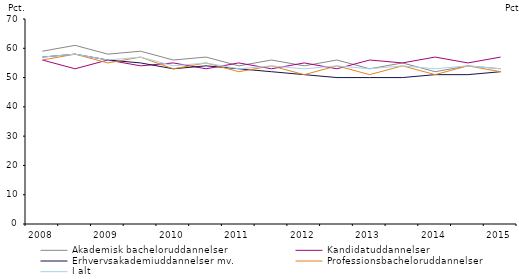
| Category | Akademisk bacheloruddannelser | Kandidatuddannelser | Erhvervsakademiuddannelser mv. | Professionsbacheloruddannelser | I alt |
|---|---|---|---|---|---|
| 2008.0 | 59 | 56 | 57 | 56 | 57 |
| nan | 61 | 53 | 58 | 58 | 58 |
| 2009.0 | 58 | 56 | 56 | 55 | 56 |
| nan | 59 | 54 | 55 | 57 | 57 |
| 2010.0 | 56 | 55 | 53 | 53 | 54 |
| nan | 57 | 53 | 54 | 55 | 55 |
| 2011.0 | 54 | 55 | 53 | 52 | 53 |
| nan | 56 | 53 | 52 | 54 | 54 |
| 2012.0 | 54 | 55 | 51 | 51 | 53 |
| nan | 56 | 53 | 50 | 54 | 54 |
| 2013.0 | 53 | 56 | 50 | 51 | 53 |
| nan | 55 | 55 | 50 | 54 | 54 |
| 2014.0 | 52 | 57 | 51 | 51 | 53 |
| nan | 54 | 55 | 51 | 54 | 54 |
| 2015.0 | 53 | 57 | 52 | 52 | 53 |